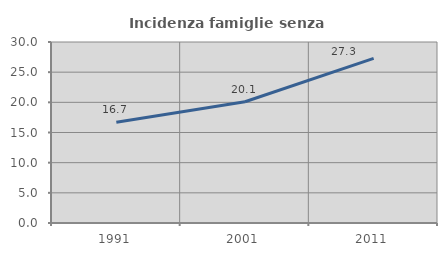
| Category | Incidenza famiglie senza nuclei |
|---|---|
| 1991.0 | 16.71 |
| 2001.0 | 20.092 |
| 2011.0 | 27.292 |